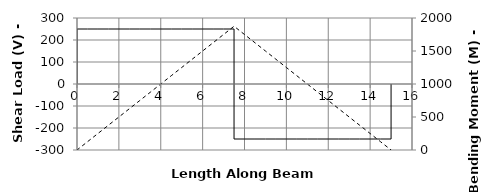
| Category | V |
|---|---|
| 0.0 | 0 |
| 0.0 | 250 |
| 0.5 | 250 |
| 1.0 | 250 |
| 1.5 | 250 |
| 2.0 | 250 |
| 2.5 | 250 |
| 3.0 | 250 |
| 3.5 | 250 |
| 4.0 | 250 |
| 4.5 | 250 |
| 5.0 | 250 |
| 5.5 | 250 |
| 6.0 | 250 |
| 6.5 | 250 |
| 7.0 | 250 |
| 7.5 | 250 |
| 7.50001 | -250 |
| 8.0 | -250 |
| 8.5 | -250 |
| 9.0 | -250 |
| 9.5 | -250 |
| 10.0 | -250 |
| 10.5 | -250 |
| 11.0 | -250 |
| 11.5 | -250 |
| 12.0 | -250 |
| 12.5 | -250 |
| 13.0 | -250 |
| 13.5 | -250 |
| 14.0 | -250 |
| 14.5 | -250 |
| 15.0 | -250 |
| 15.0 | 0 |